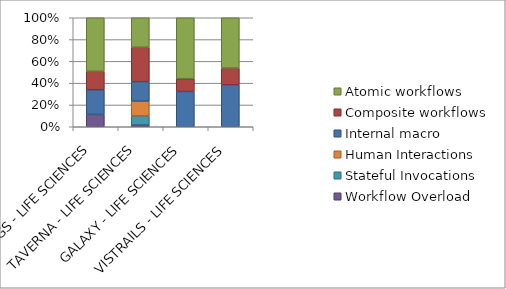
| Category | Workflow Overload | Stateful Invocations | Human Interactions | Internal macro | Composite workflows | Atomic workflows |
|---|---|---|---|---|---|---|
| WINGS - LIFE SCIENCES | 6 | 0 | 0 | 12 | 9 | 26 |
| TAVERNA - LIFE SCIENCES | 2 | 9 | 15 | 20 | 35 | 30 |
| GALAXY - LIFE SCIENCES | 0 | 0 | 0 | 11 | 4 | 19 |
| VISTRAILS - LIFE SCIENCES | 0 | 0 | 0 | 5 | 2 | 6 |